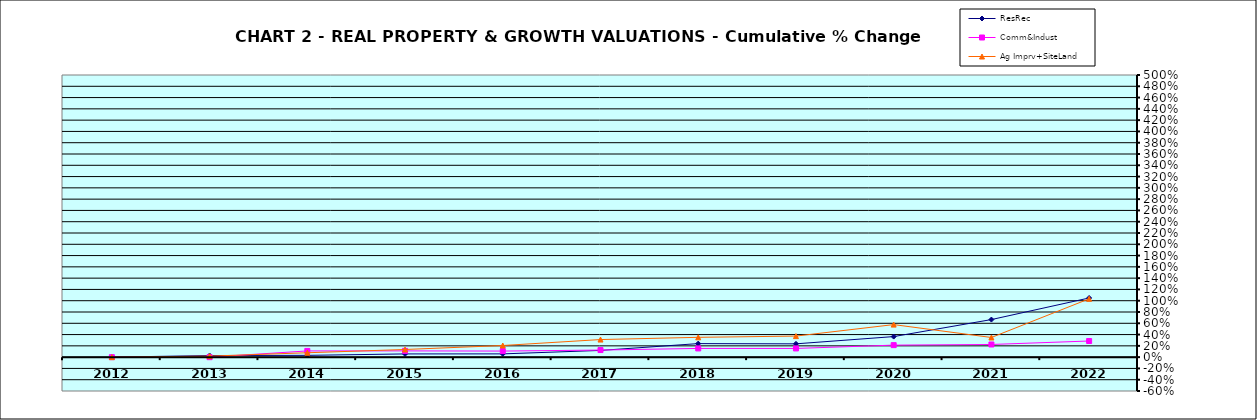
| Category | ResRec | Comm&Indust | Ag Imprv+SiteLand |
|---|---|---|---|
| 2012.0 | 0 | 0 | 0 |
| 2013.0 | 0.029 | -0.001 | 0.018 |
| 2014.0 | 0.032 | 0.11 | 0.078 |
| 2015.0 | 0.057 | 0.111 | 0.135 |
| 2016.0 | 0.058 | 0.108 | 0.206 |
| 2017.0 | 0.119 | 0.126 | 0.312 |
| 2018.0 | 0.24 | 0.154 | 0.351 |
| 2019.0 | 0.236 | 0.154 | 0.373 |
| 2020.0 | 0.364 | 0.213 | 0.577 |
| 2021.0 | 0.666 | 0.225 | 0.348 |
| 2022.0 | 1.049 | 0.286 | 1.034 |